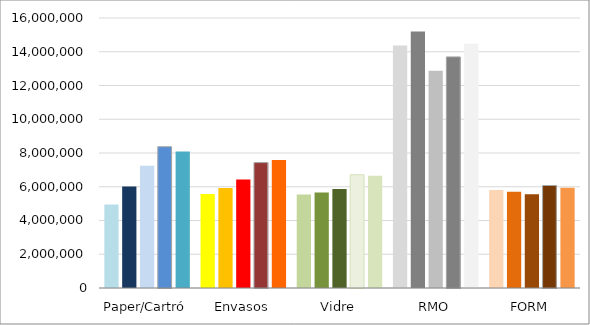
| Category | 2017 | 2018 | 2019 | 2020 | 2021 |
|---|---|---|---|---|---|
| Paper/Cartró | 4942041.08 | 6013571 | 7250915.57 | 8372094.29 | 8090302.45 |
| Envasos | 5575107.73 | 5928109.878 | 6429631.798 | 7431100.19 | 7590683.09 |
| Vidre | 5541900.6 | 5658040.77 | 5865100 | 6711220.02 | 6647819.13 |
| RMO | 14364260 | 15207098 | 12866677.82 | 13694820.1 | 14469238.01 |
| FORM | 5812523.86 | 5697171.03 | 5559130.04 | 6073854.03 | 5947509.98 |